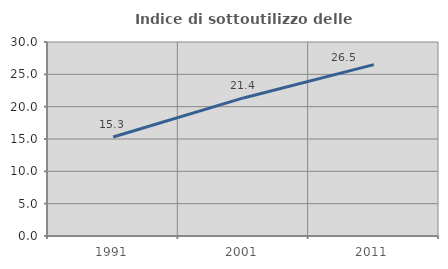
| Category | Indice di sottoutilizzo delle abitazioni  |
|---|---|
| 1991.0 | 15.305 |
| 2001.0 | 21.351 |
| 2011.0 | 26.495 |